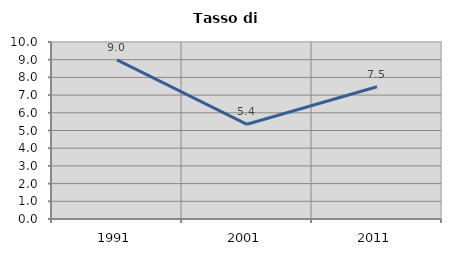
| Category | Tasso di disoccupazione   |
|---|---|
| 1991.0 | 8.992 |
| 2001.0 | 5.351 |
| 2011.0 | 7.47 |